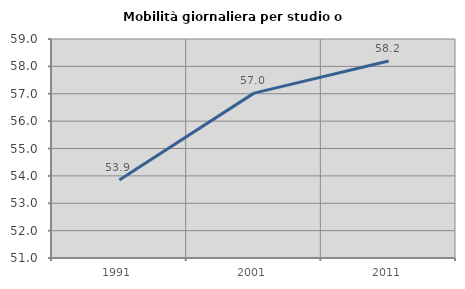
| Category | Mobilità giornaliera per studio o lavoro |
|---|---|
| 1991.0 | 53.852 |
| 2001.0 | 57.023 |
| 2011.0 | 58.194 |